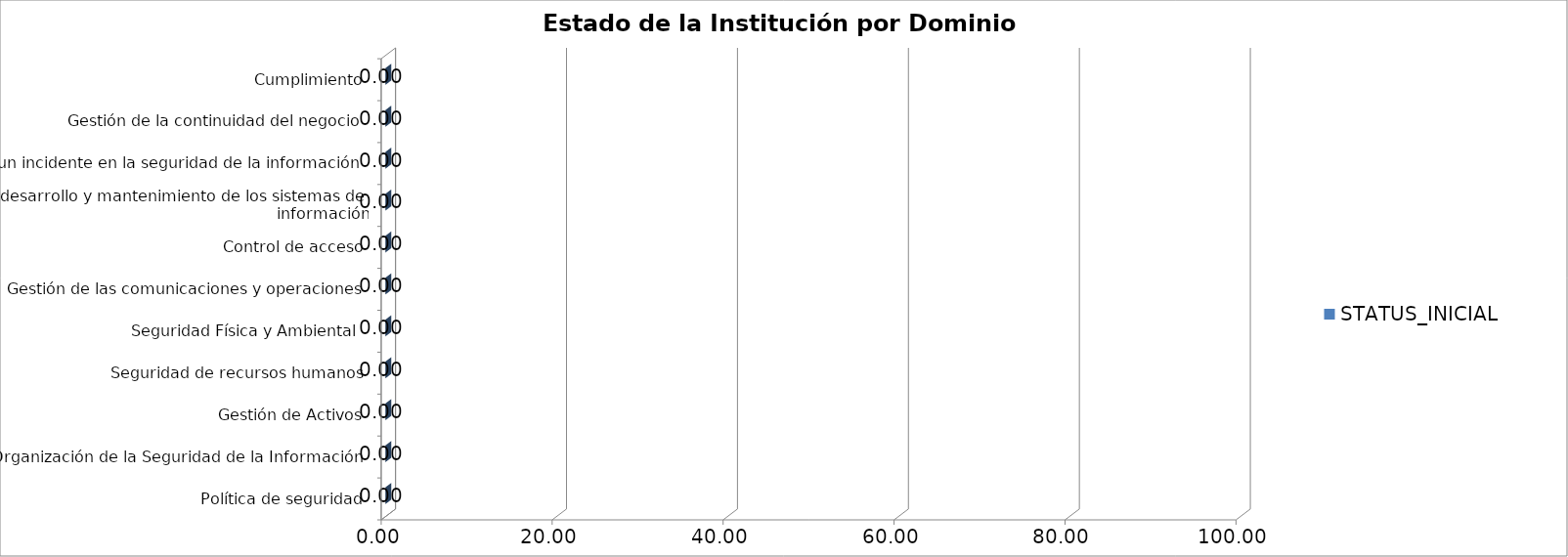
| Category | STATUS_INICIAL |
|---|---|
| Política de seguridad | 0 |
| Organización de la Seguridad de la Información | 0 |
| Gestión de Activos | 0 |
| Seguridad de recursos humanos | 0 |
| Seguridad Física y Ambiental  | 0 |
| Gestión de las comunicaciones y operaciones | 0 |
| Control de acceso | 0 |
| Adquisición, desarrollo y mantenimiento de los sistemas de información | 0 |
| Gestión de un incidente en la seguridad de la información | 0 |
| Gestión de la continuidad del negocio | 0 |
| Cumplimiento | 0 |